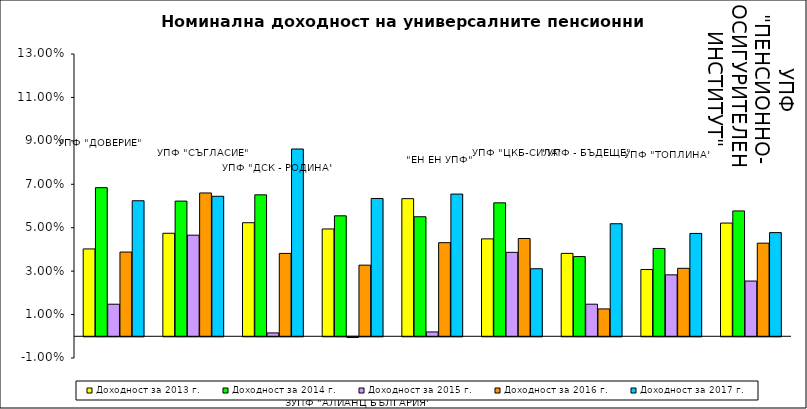
| Category | Доходност за 2013 г. | Доходност за 2014 г. | Доходност за 2015 г. | Доходност за 2016 г. | Доходност за 2017 г. |
|---|---|---|---|---|---|
| УПФ "ДОВЕРИЕ"  | 0.04 | 0.068 | 0.015 | 0.039 | 0.062 |
| УПФ "СЪГЛАСИЕ" | 0.047 | 0.062 | 0.047 | 0.066 | 0.064 |
| УПФ "ДСК - РОДИНА" | 0.052 | 0.065 | 0.002 | 0.038 | 0.086 |
| ЗУПФ "АЛИАНЦ БЪЛГАРИЯ" | 0.049 | 0.055 | 0 | 0.033 | 0.063 |
| "ЕН ЕН УПФ" | 0.063 | 0.055 | 0.002 | 0.043 | 0.065 |
| УПФ "ЦКБ-СИЛА" | 0.045 | 0.061 | 0.039 | 0.045 | 0.031 |
| "УПФ - БЪДЕЩЕ" | 0.038 | 0.037 | 0.015 | 0.013 | 0.052 |
| УПФ "ТОПЛИНА" | 0.031 | 0.04 | 0.028 | 0.031 | 0.047 |
| УПФ "ПЕНСИОННООСИГУРИТЕЛЕН ИНСТИТУТ" | 0.052 | 0.058 | 0.025 | 0.043 | 0.048 |